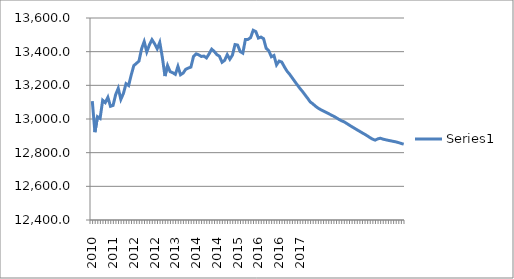
| Category | Series 0 |
|---|---|
| 2010.0 | 13105.473 |
| 2011.0 | 12921.777 |
| 2011.0 | 13013.832 |
| 2011.0 | 13003.564 |
| 2011.0 | 13111.187 |
| 2011.0 | 13097.006 |
| 2011.0 | 13128.768 |
| 2011.0 | 13075.516 |
| 2011.0 | 13080.493 |
| 2011.0 | 13144.669 |
| 2011.0 | 13182.188 |
| 2011.0 | 13116.6 |
| 2011.0 | 13151.981 |
| 2012.0 | 13209.836 |
| 2012.0 | 13198.933 |
| 2012.0 | 13261.503 |
| 2012.0 | 13317.486 |
| 2012.0 | 13330.171 |
| 2012.0 | 13344.757 |
| 2012.0 | 13417.764 |
| 2012.0 | 13459.908 |
| 2012.0 | 13398.731 |
| 2012.0 | 13439.998 |
| 2012.0 | 13470.892 |
| 2012.0 | 13447.679 |
| 2013.0 | 13416.982 |
| 2013.0 | 13455.095 |
| 2013.0 | 13365.427 |
| 2013.0 | 13255.197 |
| 2013.0 | 13317.731 |
| 2013.0 | 13281.314 |
| 2013.0 | 13274.915 |
| 2013.0 | 13265.303 |
| 2013.0 | 13312.41 |
| 2013.0 | 13262.825 |
| 2013.0 | 13272.755 |
| 2013.0 | 13295.249 |
| 2014.0 | 13302.523 |
| 2014.0 | 13308.493 |
| 2014.0 | 13371.235 |
| 2014.0 | 13387.14 |
| 2014.0 | 13381.227 |
| 2014.0 | 13371.598 |
| 2014.0 | 13373.761 |
| 2014.0 | 13362.953 |
| 2014.0 | 13386.886 |
| 2014.0 | 13414.676 |
| 2014.0 | 13401.433 |
| 2014.0 | 13382.557 |
| 2015.0 | 13372.681 |
| 2015.0 | 13336.876 |
| 2015.0 | 13348.657 |
| 2015.0 | 13382.075 |
| 2015.0 | 13355.274 |
| 2015.0 | 13379.469 |
| 2015.0 | 13442.264 |
| 2015.0 | 13439.096 |
| 2015.0 | 13400.309 |
| 2015.0 | 13391.419 |
| 2015.0 | 13472.545 |
| 2015.0 | 13472.868 |
| 2016.0 | 13483.162 |
| 2016.0 | 13527.136 |
| 2016.0 | 13519.536 |
| 2016.0 | 13480.652 |
| 2016.0 | 13486.664 |
| 2016.0 | 13477.334 |
| 2016.0 | 13419.916 |
| 2016.0 | 13405.97 |
| 2016.0 | 13369.879 |
| 2016.0 | 13377.379 |
| 2016.0 | 13321.598 |
| 2016.0 | 13343.895 |
| 2017.0 | 13338.462 |
| 2017.0 | 13310.567 |
| 2017.0 | 13284.912 |
| 2017.0 | 13266.572 |
| 2017.0 | 13245.336 |
| 2017.0 | 13223.65 |
| 2017.0 | 13202.477 |
| 2017.0 | 13181.98 |
| 2017.0 | 13163.144 |
| 2017.0 | 13143.008 |
| 2017.0 | 13122.589 |
| 2017.0 | 13101.205 |